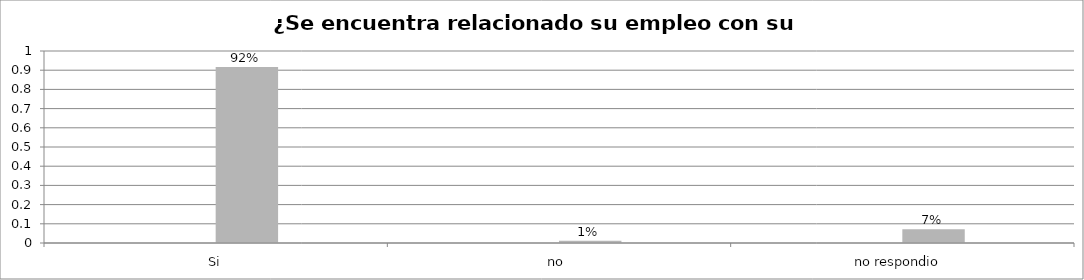
| Category | Series 0 | Series 1 | Series 2 | Series 3 |
|---|---|---|---|---|
| Si |  |  | 0.917 |  |
| no  |  |  | 0.011 |  |
| no respondio  |  |  | 0.072 |  |